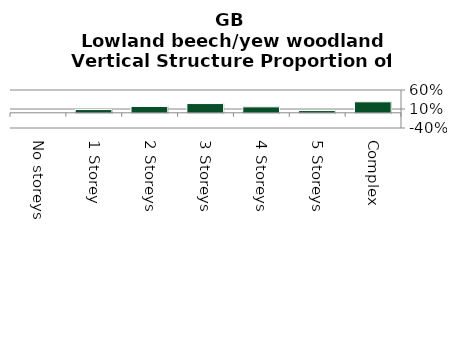
| Category | Lowland beech/yew woodland |
|---|---|
| No storeys | 0 |
| 1 Storey | 0.086 |
| 2 Storeys | 0.166 |
| 3 Storeys | 0.243 |
| 4 Storeys | 0.157 |
| 5 Storeys | 0.059 |
| Complex | 0.289 |